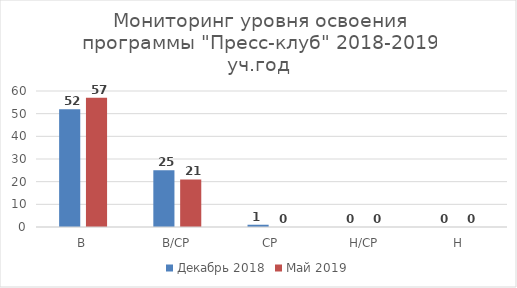
| Category | Декабрь 2018 | Май 2019 |
|---|---|---|
| В | 52 | 57 |
| В/СР | 25 | 21 |
| СР | 1 | 0 |
| Н/СР | 0 | 0 |
| Н | 0 | 0 |